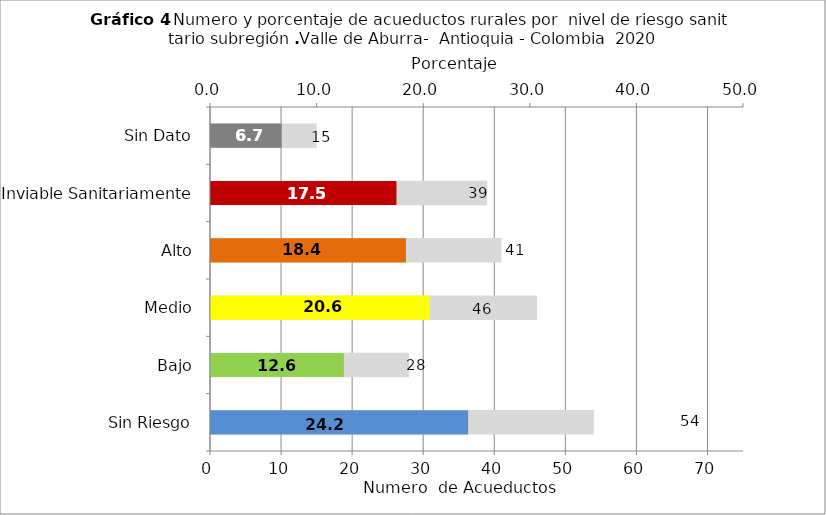
| Category | Número de Sistemas |
|---|---|
| Sin Riesgo | 54 |
| Bajo | 28 |
| Medio | 46 |
| Alto | 41 |
| Inviable Sanitariamente | 39 |
| Sin Dato | 15 |